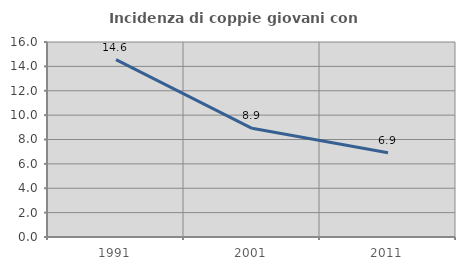
| Category | Incidenza di coppie giovani con figli |
|---|---|
| 1991.0 | 14.554 |
| 2001.0 | 8.92 |
| 2011.0 | 6.91 |